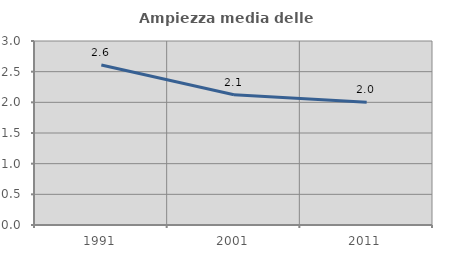
| Category | Ampiezza media delle famiglie |
|---|---|
| 1991.0 | 2.608 |
| 2001.0 | 2.122 |
| 2011.0 | 2 |